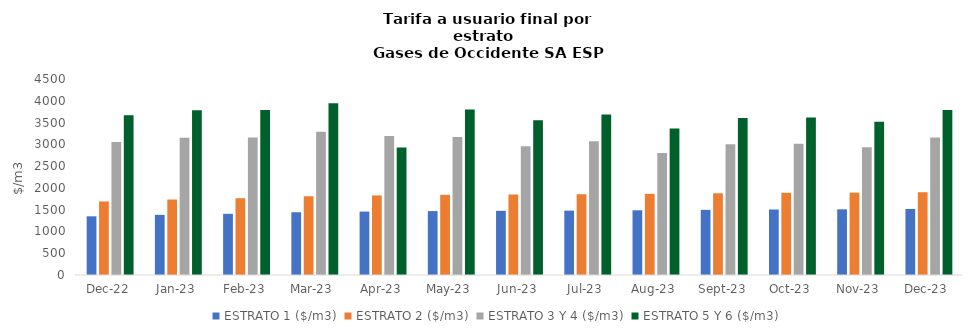
| Category | ESTRATO 1 ($/m3) | ESTRATO 2 ($/m3) | ESTRATO 3 Y 4 ($/m3) | ESTRATO 5 Y 6 ($/m3) |
|---|---|---|---|---|
| 2022-12-01 | 1347.43 | 1688.66 | 3054.71 | 3665.652 |
| 2023-01-01 | 1380.44 | 1732.41 | 3153.94 | 3784.728 |
| 2023-02-01 | 1405.01 | 1763.25 | 3155.49 | 3786.588 |
| 2023-03-01 | 1440.79 | 1807.57 | 3288.4 | 3946.08 |
| 2023-04-01 | 1455.91 | 1826.55 | 3194.1 | 2929.63 |
| 2023-05-01 | 1467.27 | 1840.8 | 3166.38 | 3799.656 |
| 2023-06-01 | 1473.58 | 1848.72 | 2958.7 | 3550.44 |
| 2023-07-01 | 1478 | 1854.26 | 3071.96 | 3686.352 |
| 2023-08-01 | 1485.39 | 1863.53 | 2800.92 | 3361.104 |
| 2023-09-01 | 1495.79 | 1876.58 | 3003.77 | 3604.524 |
| 2023-10-01 | 1503.86 | 1886.71 | 3011.88 | 3614.256 |
| 2023-11-01 | 1507.62 | 1891.43 | 2933.28 | 3519.936 |
| 2023-12-01 | 1514.69 | 1900.29 | 3156.1 | 3787.32 |